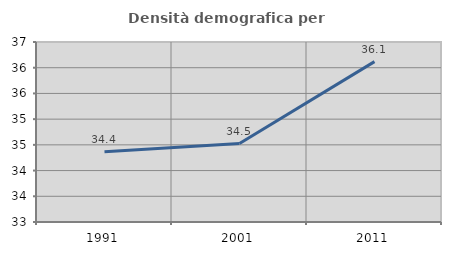
| Category | Densità demografica |
|---|---|
| 1991.0 | 34.364 |
| 2001.0 | 34.526 |
| 2011.0 | 36.119 |